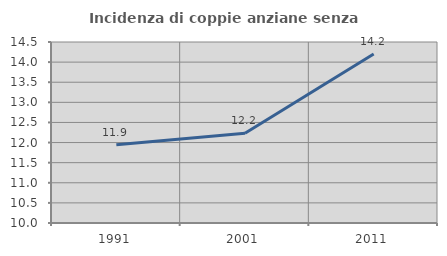
| Category | Incidenza di coppie anziane senza figli  |
|---|---|
| 1991.0 | 11.946 |
| 2001.0 | 12.229 |
| 2011.0 | 14.203 |